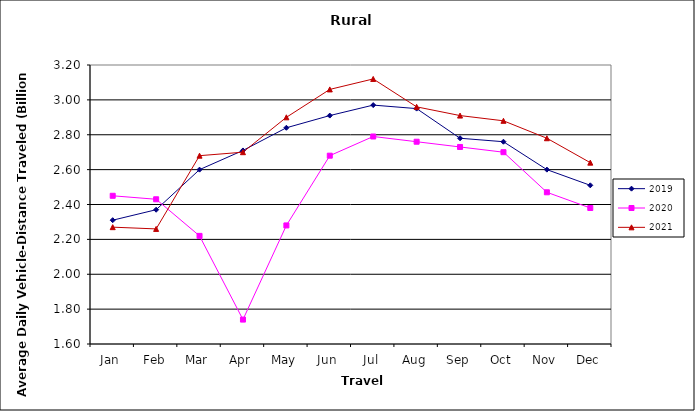
| Category | 2019 | 2020 | 2021 |
|---|---|---|---|
| Jan | 2.31 | 2.45 | 2.27 |
| Feb | 2.37 | 2.43 | 2.26 |
| Mar | 2.6 | 2.22 | 2.68 |
| Apr | 2.71 | 1.74 | 2.7 |
| May | 2.84 | 2.28 | 2.9 |
| Jun | 2.91 | 2.68 | 3.06 |
| Jul | 2.97 | 2.79 | 3.12 |
| Aug | 2.95 | 2.76 | 2.96 |
| Sep | 2.78 | 2.73 | 2.91 |
| Oct | 2.76 | 2.7 | 2.88 |
| Nov | 2.6 | 2.47 | 2.78 |
| Dec | 2.51 | 2.38 | 2.64 |